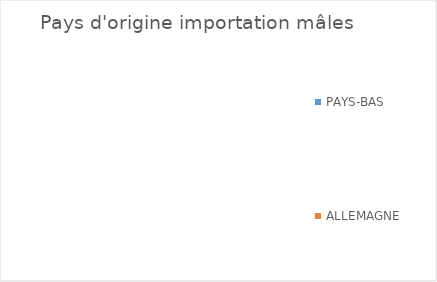
| Category | Series 0 |
|---|---|
| PAYS-BAS | 0 |
| ALLEMAGNE | 0 |